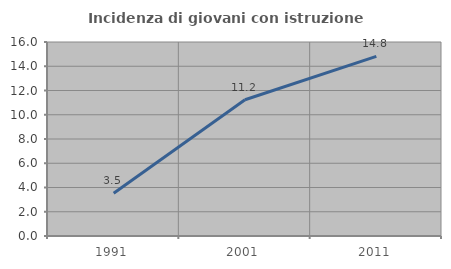
| Category | Incidenza di giovani con istruzione universitaria |
|---|---|
| 1991.0 | 3.529 |
| 2001.0 | 11.236 |
| 2011.0 | 14.815 |